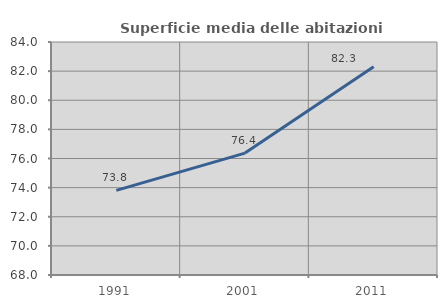
| Category | Superficie media delle abitazioni occupate |
|---|---|
| 1991.0 | 73.808 |
| 2001.0 | 76.37 |
| 2011.0 | 82.3 |